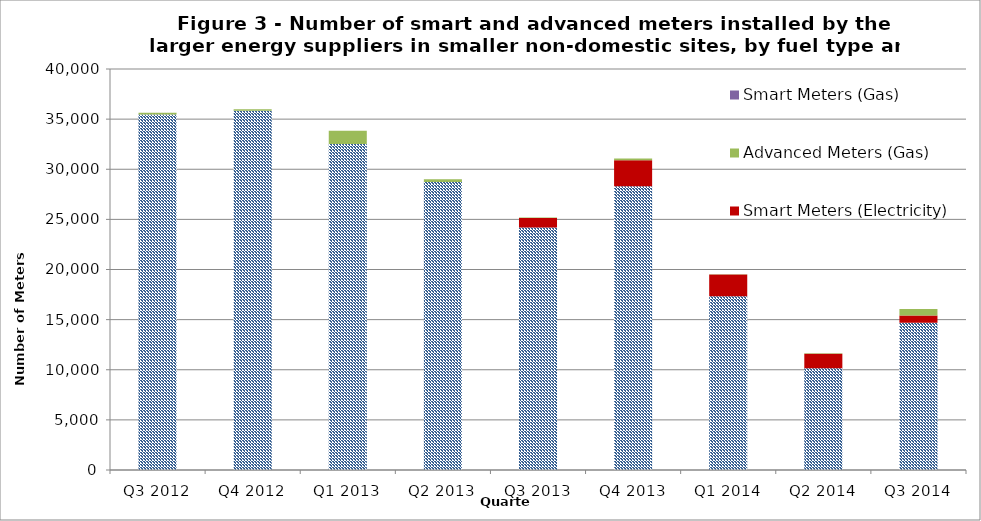
| Category | Advanced Meters (Electricity)  | Smart Meters (Electricity) | Advanced Meters (Gas) | Smart Meters (Gas) |
|---|---|---|---|---|
| Q3 2012 | 35455 | 0 | 186 | 0 |
| Q4 2012 | 35834 | 0 | 144 | 0 |
| Q1 2013 | 32529 | 0 | 1321 | 0 |
| Q2 2013 | 28722 | 0 | 290 | 0 |
| Q3 2013 | 24189 | 946 | 60 | 0 |
| Q4 2013 | 28300 | 2590 | 184 | 0 |
| Q1 2014 | 17332 | 2175 | 24 | 0 |
| Q2 2014 | 10152 | 1445 | 59 | 0 |
| Q3 2014 | 14700 | 714 | 647 | 0 |